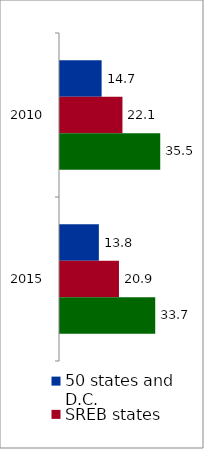
| Category | 50 states and D.C. | SREB states | State |
|---|---|---|---|
| 2010.0 | 14.732 | 22.107 | 35.481 |
| 2015.0 | 13.757 | 20.872 | 33.709 |